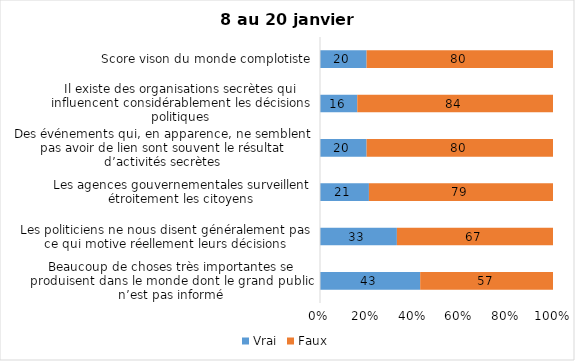
| Category | Vrai | Faux |
|---|---|---|
| Beaucoup de choses très importantes se produisent dans le monde dont le grand public n’est pas informé | 43 | 57 |
| Les politiciens ne nous disent généralement pas ce qui motive réellement leurs décisions | 33 | 67 |
| Les agences gouvernementales surveillent étroitement les citoyens | 21 | 79 |
| Des événements qui, en apparence, ne semblent pas avoir de lien sont souvent le résultat d’activités secrètes | 20 | 80 |
| Il existe des organisations secrètes qui influencent considérablement les décisions politiques | 16 | 84 |
| Score vison du monde complotiste | 20 | 80 |